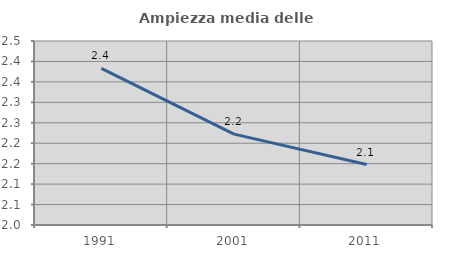
| Category | Ampiezza media delle famiglie |
|---|---|
| 1991.0 | 2.383 |
| 2001.0 | 2.222 |
| 2011.0 | 2.148 |